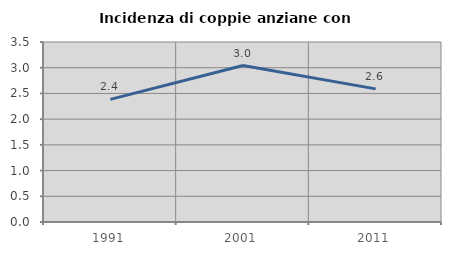
| Category | Incidenza di coppie anziane con figli |
|---|---|
| 1991.0 | 2.385 |
| 2001.0 | 3.042 |
| 2011.0 | 2.589 |